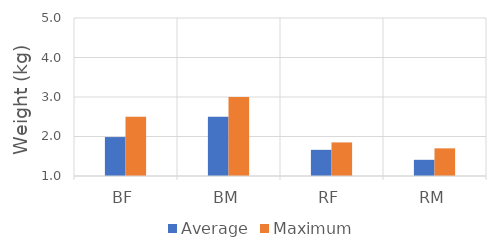
| Category | Average | Maximum |
|---|---|---|
| BF | 1.986 | 2.5 |
| BM | 2.5 | 3 |
| RF | 1.662 | 1.85 |
| RM | 1.41 | 1.7 |